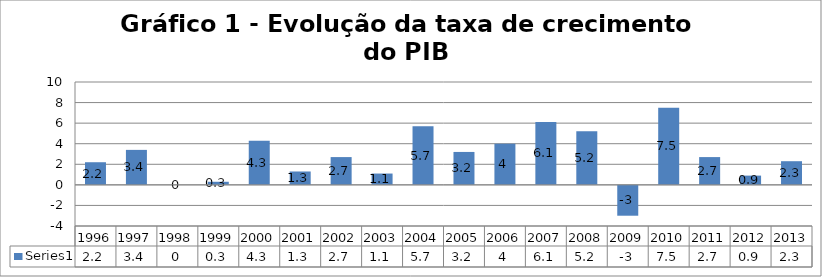
| Category | Series 0 |
|---|---|
| 1996.0 | 2.2 |
| 1997.0 | 3.4 |
| 1998.0 | 0 |
| 1999.0 | 0.3 |
| 2000.0 | 4.3 |
| 2001.0 | 1.3 |
| 2002.0 | 2.7 |
| 2003.0 | 1.1 |
| 2004.0 | 5.7 |
| 2005.0 | 3.2 |
| 2006.0 | 4 |
| 2007.0 | 6.1 |
| 2008.0 | 5.2 |
| 2009.0 | -3 |
| 2010.0 | 7.5 |
| 2011.0 | 2.7 |
| 2012.0 | 0.9 |
| 2013.0 | 2.3 |